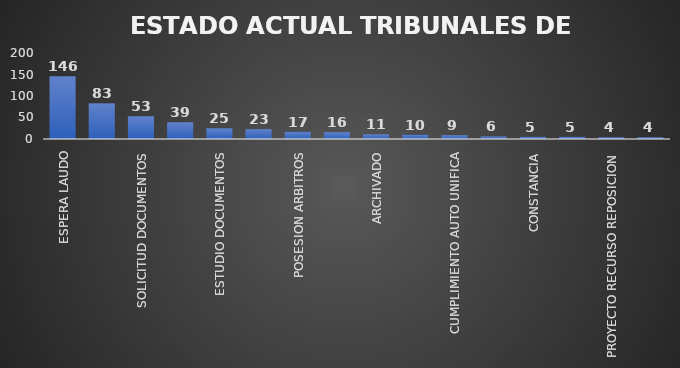
| Category | CANTIDAD | % |
|---|---|---|
| ESPERA LAUDO | 146 | 0.31 |
| RECURSO ANULACION LAUDO | 83 | 0.168 |
| SOLICITUD DOCUMENTOS | 53 | 0.121 |
| PAGO HONORARIOS | 39 | 0.067 |
| ESTUDIO DOCUMENTOS | 25 | 0.051 |
| PROYECTO ARCHIVO | 23 | 0.055 |
| POSESION ARBITROS | 17 | 0.033 |
| FIRMA CONVOCA E INTEGRA | 16 | 0.036 |
| ARCHIVADO | 11 | 0.025 |
| INVESTIGACIÓN ADTIVA  | 10 | 0.019 |
| CUMPLIMIENTO AUTO UNIFICA | 9 | 0.02 |
| PROYECTO MODIFICA RESOLUCION | 6 | 0.013 |
| CONSTANCIA | 5 | 0.013 |
| DESIGNACION ARBITRO | 5 | 0.014 |
| PROYECTO RECURSO REPOSICION | 4 | 0.009 |
| AUTO CUMPLIMIENTO TERMINOS | 4 | 0.009 |